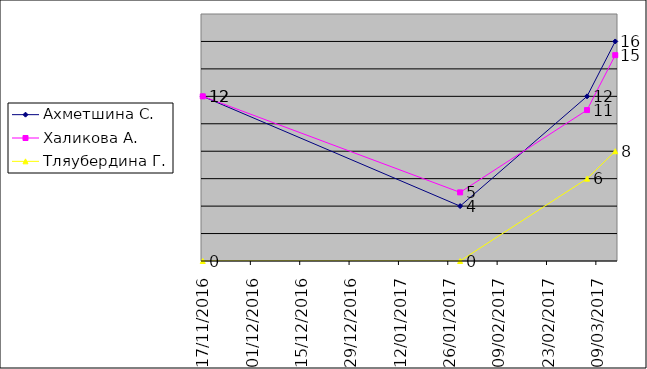
| Category | Ахметшина С. | Халикова А. | Тляубердина Г. |
|---|---|---|---|
| 17/11/2016 | 12 | 12 | 0 |
| 29/01/2017 | 4 | 5 | 0 |
| 06/03/2017 | 12 | 11 | 6 |
| 14/03/2017 | 16 | 15 | 8 |